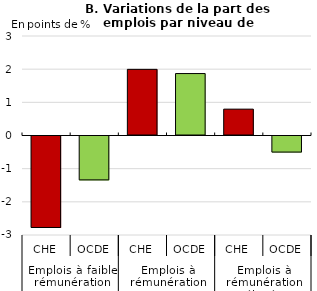
| Category | Total |
|---|---|
| 0 | -2.789 |
| 1 | -1.353 |
| 2 | 1.994 |
| 3 | 1.868 |
| 4 | 0.795 |
| 5 | -0.515 |